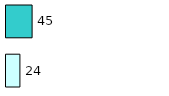
| Category | Series 0 | Series 1 |
|---|---|---|
| 0 | 24 | 45 |